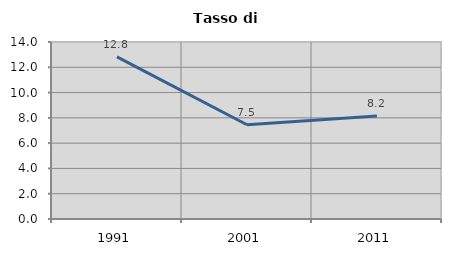
| Category | Tasso di disoccupazione   |
|---|---|
| 1991.0 | 12.827 |
| 2001.0 | 7.454 |
| 2011.0 | 8.156 |